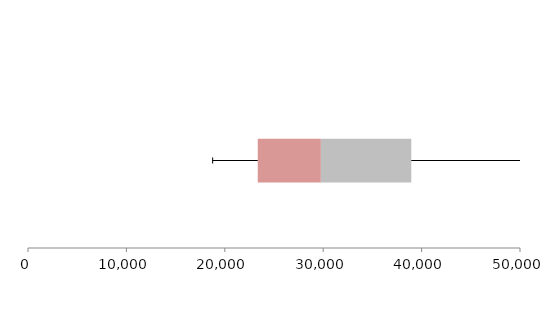
| Category | Series 1 | Series 2 | Series 3 |
|---|---|---|---|
| 0 | 23350.618 | 6411.947 | 9188.4 |